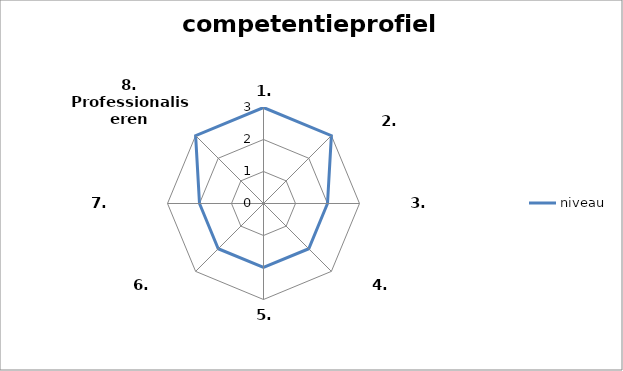
| Category | niveau |
|---|---|
| 1. Analyseren | 3 |
| 2. Ontwerpen | 3 |
| 3. Realiseren | 2 |
| 4. Beheren | 2 |
| 5. Managen | 2 |
| 6. Adviseren | 2 |
| 7. Onderzoeken | 2 |
| 8. Professionaliseren | 3 |